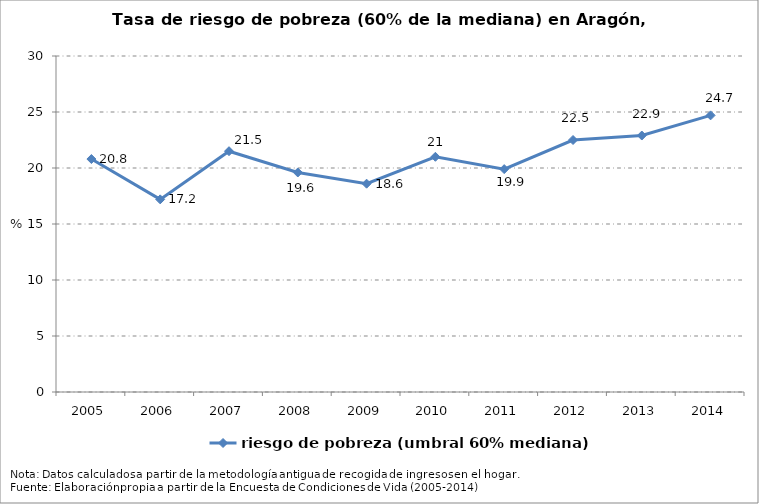
| Category | riesgo de pobreza (umbral 60% mediana) |
|---|---|
| 2005.0 | 20.8 |
| 2006.0 | 17.2 |
| 2007.0 | 21.5 |
| 2008.0 | 19.6 |
| 2009.0 | 18.6 |
| 2010.0 | 21 |
| 2011.0 | 19.9 |
| 2012.0 | 22.5 |
| 2013.0 | 22.9 |
| 2014.0 | 24.7 |